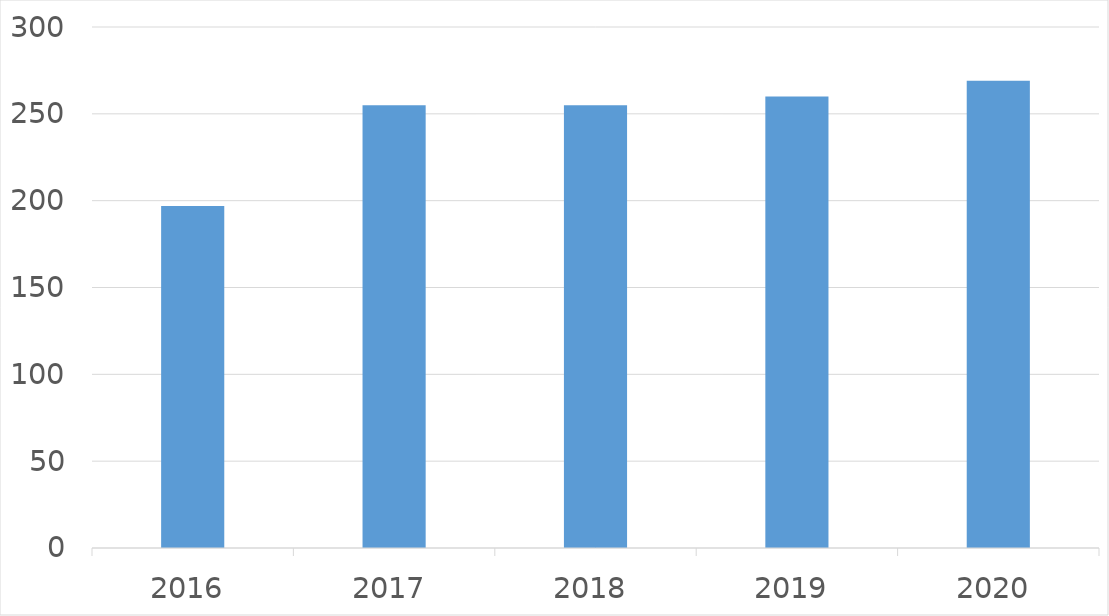
| Category | Series 0 |
|---|---|
| 2016 | 197 |
| 2017 | 255 |
| 2018 | 255 |
| 2019 | 260 |
| 2020 | 269 |